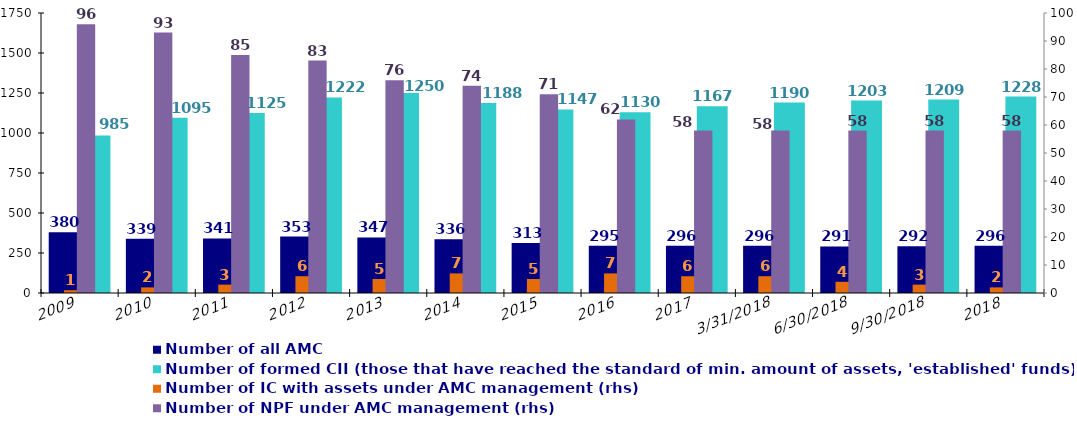
| Category | Number of registered CII per one AMC  | Number of all AMC    | Number of AMC with CII under management | Number of formed CII (those that have reached the standard of min. amount of assets, 'established' funds) |
|---|---|---|---|---|
| 2009 |  | 380 |  | 985 |
| 2010 |  | 339 |  | 1095 |
| 2011 |  | 341 |  | 1125 |
| 2012 |  | 353 |  | 1222 |
| 2013 |  | 347 |  | 1250 |
| 2014 |  | 336 |  | 1188 |
| 2015 |  | 313 |  | 1147 |
| 2016 |  | 295 |  | 1130 |
| 2017 |  | 296 |  | 1167 |
| 31.03.2018 |  | 296 |  | 1190 |
| 30.06.2018 |  | 291 |  | 1203 |
| 30.09.2018 |  | 292 |  | 1209 |
| 2018 |  | 296 |  | 1228 |